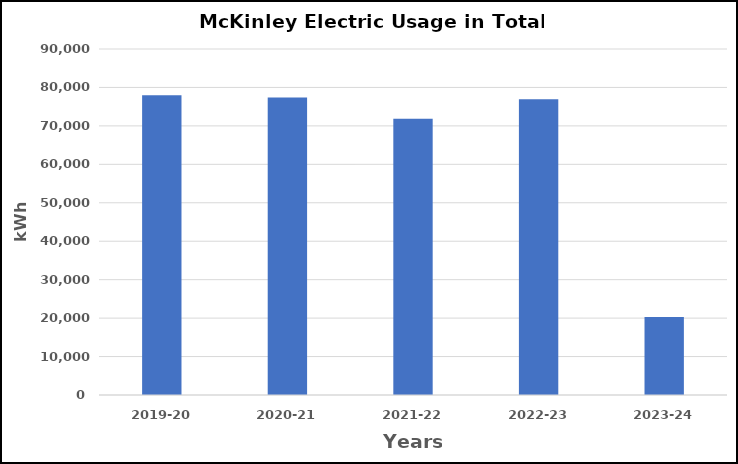
| Category | Series 0 |
|---|---|
| 2019-20 | 78000 |
| 2020-21 | 77399 |
| 2021-22 | 71880 |
| 2022-23 | 76920 |
| 2023-24 | 20280 |